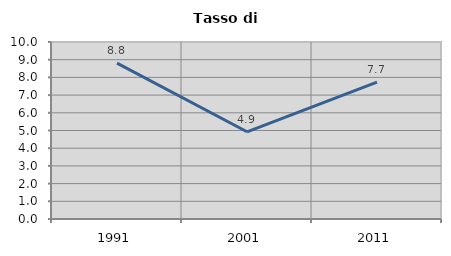
| Category | Tasso di disoccupazione   |
|---|---|
| 1991.0 | 8.806 |
| 2001.0 | 4.928 |
| 2011.0 | 7.732 |